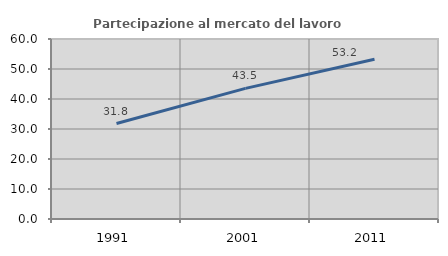
| Category | Partecipazione al mercato del lavoro  femminile |
|---|---|
| 1991.0 | 31.81 |
| 2001.0 | 43.532 |
| 2011.0 | 53.234 |